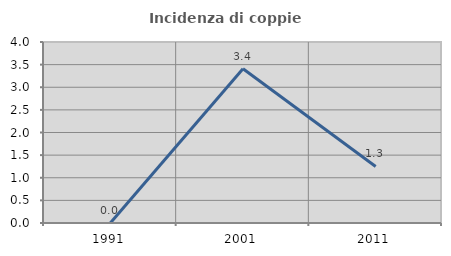
| Category | Incidenza di coppie miste |
|---|---|
| 1991.0 | 0 |
| 2001.0 | 3.409 |
| 2011.0 | 1.25 |